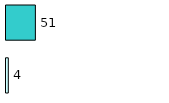
| Category | Series 0 | Series 1 |
|---|---|---|
| 0 | 4 | 51 |